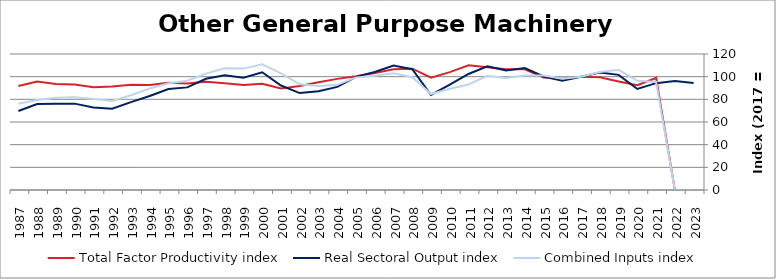
| Category | Total Factor Productivity index | Real Sectoral Output index | Combined Inputs index |
|---|---|---|---|
| 2023.0 | 0 | 94.496 | 0 |
| 2022.0 | 0 | 96.249 | 0 |
| 2021.0 | 98.843 | 94.267 | 95.37 |
| 2020.0 | 92.425 | 89.149 | 96.455 |
| 2019.0 | 95.769 | 101.577 | 106.066 |
| 2018.0 | 99.444 | 103.592 | 104.172 |
| 2017.0 | 100 | 100 | 100 |
| 2016.0 | 98.059 | 96.343 | 98.25 |
| 2015.0 | 99.183 | 100.13 | 100.954 |
| 2014.0 | 106.465 | 107.587 | 101.054 |
| 2013.0 | 106.53 | 105.374 | 98.915 |
| 2012.0 | 108.281 | 109.083 | 100.741 |
| 2011.0 | 110.002 | 102.374 | 93.066 |
| 2010.0 | 103.97 | 92.922 | 89.374 |
| 2009.0 | 99.043 | 83.846 | 84.656 |
| 2008.0 | 107.029 | 106.562 | 99.564 |
| 2007.0 | 106.62 | 109.82 | 103.001 |
| 2006.0 | 103.242 | 104.157 | 100.887 |
| 2005.0 | 100.434 | 99.804 | 99.373 |
| 2004.0 | 98.054 | 91.006 | 92.812 |
| 2003.0 | 94.979 | 87.191 | 91.8 |
| 2002.0 | 91.767 | 85.541 | 93.215 |
| 2001.0 | 89.512 | 92.162 | 102.96 |
| 2000.0 | 93.683 | 103.875 | 110.879 |
| 1999.0 | 92.562 | 99.149 | 107.116 |
| 1998.0 | 94.216 | 101.142 | 107.352 |
| 1997.0 | 95.516 | 98.103 | 102.709 |
| 1996.0 | 93.953 | 90.552 | 96.38 |
| 1995.0 | 94.673 | 89.157 | 94.174 |
| 1994.0 | 92.645 | 82.908 | 89.49 |
| 1993.0 | 92.779 | 77.555 | 83.591 |
| 1992.0 | 91.419 | 71.792 | 78.531 |
| 1991.0 | 90.681 | 72.737 | 80.212 |
| 1990.0 | 93.152 | 76.211 | 81.813 |
| 1989.0 | 93.489 | 76.099 | 81.399 |
| 1988.0 | 95.658 | 75.935 | 79.381 |
| 1987.0 | 91.701 | 69.714 | 76.023 |